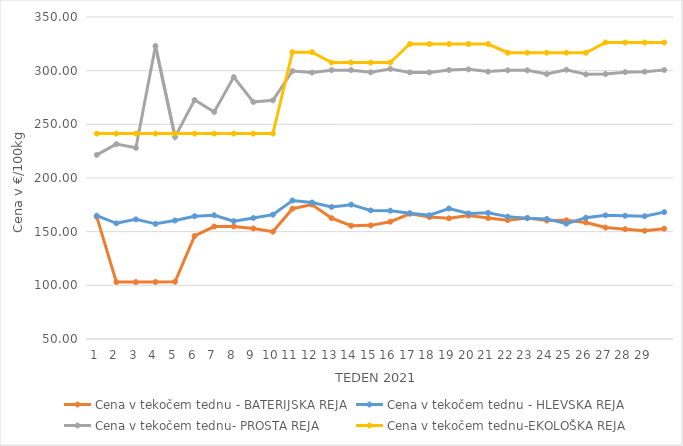
| Category | Cena v tekočem tednu - BATERIJSKA REJA | Cena v tekočem tednu - HLEVSKA REJA | Cena v tekočem tednu- PROSTA REJA | Cena v tekočem tednu-EKOLOŠKA REJA |
|---|---|---|---|---|
| 1.0 | 163.81 | 164.86 | 221.55 | 241.38 |
| 2.0 | 103.02 | 157.81 | 231.55 | 241.38 |
| 3.0 | 103.03 | 161.48 | 228.1 | 241.38 |
| 4.0 | 103.15 | 157.29 | 322.93 | 241.38 |
| 5.0 | 103.34 | 160.43 | 238.28 | 241.38 |
| 6.0 | 146.03 | 164.39 | 272.76 | 241.38 |
| 7.0 | 154.77 | 165.34 | 261.55 | 241.38 |
| 8.0 | 154.86 | 159.79 | 293.97 | 241.38 |
| 9.0 | 153 | 162.73 | 270.86 | 241.38 |
| 10.0 | 149.98 | 165.85 | 272.41 | 241.38 |
| 11.0 | 171.4 | 179.09 | 299.66 | 317.24 |
| 12.0 | 175.2 | 177.21 | 298.27 | 317.24 |
| 13.0 | 162.57 | 173.07 | 300.45 | 307.59 |
| 14.0 | 155.55 | 175.17 | 300.49 | 307.59 |
| 15.0 | 155.88 | 169.83 | 298.52 | 307.59 |
| 16.0 | 159.26 | 169.55 | 301.6 | 307.59 |
| 17.0 | 166.66 | 167.25 | 298.38 | 324.83 |
| 18.0 | 163.58 | 165.28 | 298.35 | 324.83 |
| 19.0 | 162.44 | 171.6 | 300.59 | 324.83 |
| 20.0 | 164.94 | 167.01 | 301.21 | 324.83 |
| 21.0 | 162.64 | 167.56 | 299.14 | 324.83 |
| 22.0 | 160.68 | 164.01 | 300.34 | 316.72 |
| 23.0 | 162.75 | 162.58 | 300.35 | 316.72 |
| 24.0 | 160.34 | 161.89 | 296.9 | 316.72 |
| 25.0 | 160.61 | 157.42 | 300.86 | 316.72 |
| 26.0 | 158.57 | 163.03 | 296.55 | 316.72 |
| 27.0 | 153.83 | 165.23 | 296.9 | 326.21 |
| 28.0 | 152.35 | 164.83 | 298.63 | 326.21 |
| 29.0 | 150.79 | 164.42 | 299.08 | 326.21 |